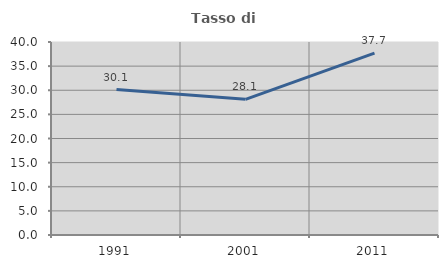
| Category | Tasso di occupazione   |
|---|---|
| 1991.0 | 30.149 |
| 2001.0 | 28.118 |
| 2011.0 | 37.701 |